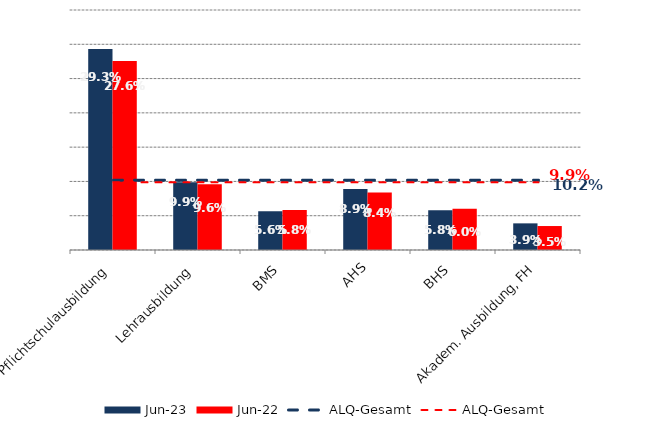
| Category | Jun 23 | Jun 22 |
|---|---|---|
| Pflichtschulausbildung | 0.293 | 0.276 |
| Lehrausbildung | 0.099 | 0.096 |
| BMS | 0.056 | 0.058 |
| AHS | 0.089 | 0.084 |
| BHS | 0.058 | 0.06 |
| Akadem. Ausbildung, FH | 0.039 | 0.035 |